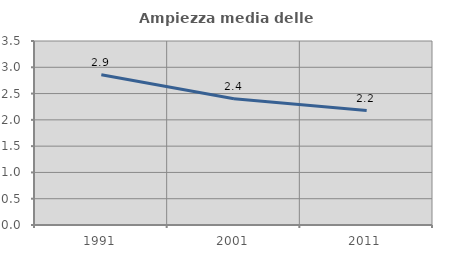
| Category | Ampiezza media delle famiglie |
|---|---|
| 1991.0 | 2.858 |
| 2001.0 | 2.4 |
| 2011.0 | 2.176 |